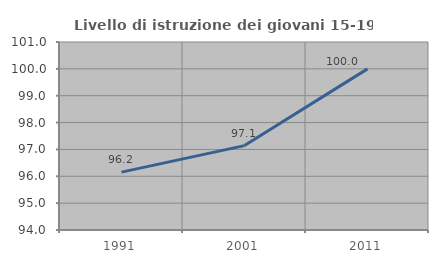
| Category | Livello di istruzione dei giovani 15-19 anni |
|---|---|
| 1991.0 | 96.154 |
| 2001.0 | 97.143 |
| 2011.0 | 100 |